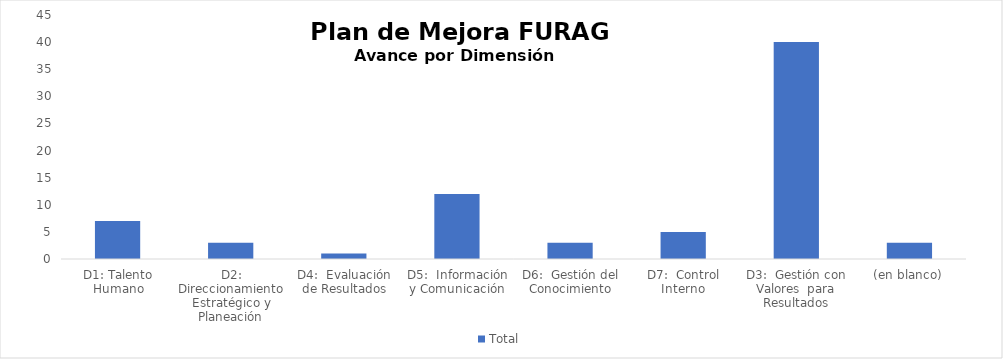
| Category | Total |
|---|---|
| D1: Talento Humano | 7 |
| D2: Direccionamiento Estratégico y Planeación | 3 |
| D4:  Evaluación de Resultados | 1 |
| D5:  Información y Comunicación | 12 |
| D6:  Gestión del Conocimiento | 3 |
| D7:  Control Interno | 5 |
| D3:  Gestión con Valores  para Resultados | 40 |
| (en blanco) | 3 |